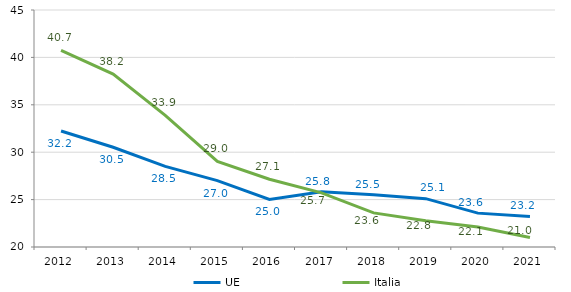
| Category | UE | Italia |
|---|---|---|
| 2012.0 | 32.237 | 40.744 |
| 2013.0 | 30.521 | 38.244 |
| 2014.0 | 28.507 | 33.889 |
| 2015.0 | 27.006 | 29.039 |
| 2016.0 | 25.024 | 27.15 |
| 2017.0 | 25.829 | 25.705 |
| 2018.0 | 25.514 | 23.596 |
| 2019.0 | 25.1 | 22.759 |
| 2020.0 | 23.573 | 22.115 |
| 2021.0 | 23.226 | 21.005 |